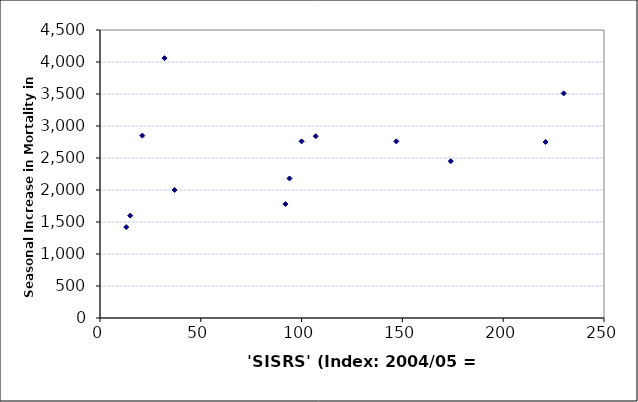
| Category | Seas. Incr. Mort |
|---|---|
| 107.0 | 2840 |
| 100.0 | 2760 |
| 92.0 | 1780 |
| 221.0 | 2750 |
| 94.0 | 2180 |
| 230.0 | 3510 |
| 147.0 | 2760 |
| 174.0 | 2450 |
| 13.0 | 1420 |
| 37.0 | 2000 |
| 15.0 | 1600 |
| 32.0 | 4060 |
| 21.0 | 2850 |